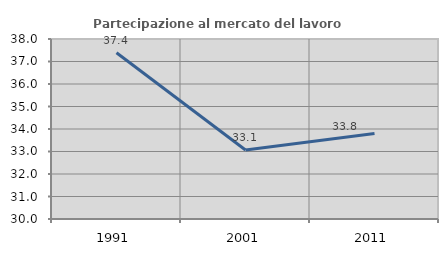
| Category | Partecipazione al mercato del lavoro  femminile |
|---|---|
| 1991.0 | 37.389 |
| 2001.0 | 33.068 |
| 2011.0 | 33.803 |